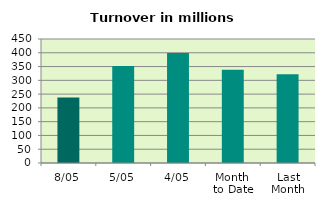
| Category | Series 0 |
|---|---|
| 8/05 | 237.892 |
| 5/05 | 351.658 |
| 4/05 | 399.151 |
| Month 
to Date | 338.418 |
| Last
Month | 322.024 |